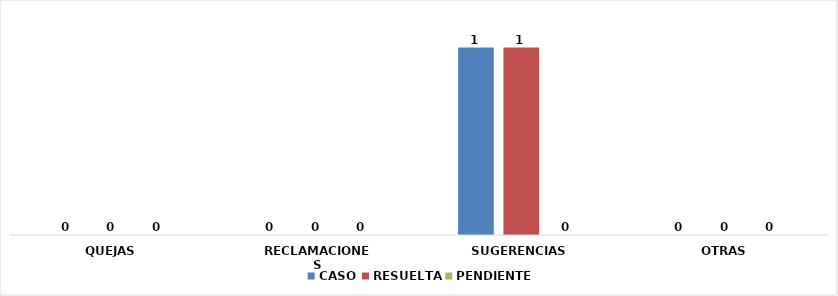
| Category | CASO | RESUELTA | PENDIENTE |
|---|---|---|---|
| QUEJAS | 0 | 0 | 0 |
| RECLAMACIONES | 0 | 0 | 0 |
| SUGERENCIAS | 1 | 1 | 0 |
| OTRAS | 0 | 0 | 0 |